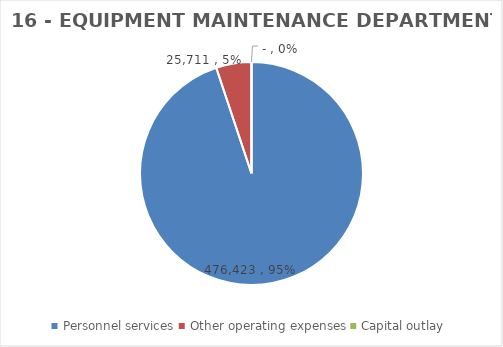
| Category | Series 0 | Series 1 | Series 2 | Series 3 | Series 4 | Series 5 | Series 6 |
|---|---|---|---|---|---|---|---|
| Personnel services | 476423 |  |  | 464782 | 472762 | 476423 | 476423 |
| Other operating expenses | 25711 |  |  | 16711 | 26370 | 39711 | 25711 |
| Capital outlay | 0 |  |  | 0 | 0 | 0 | 0 |